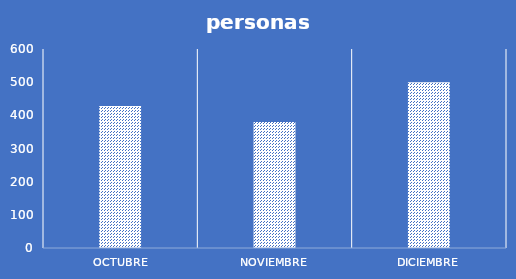
| Category | personas atendidas  |
|---|---|
| octubre | 428 |
| noviembre | 380 |
| diciembre | 500 |